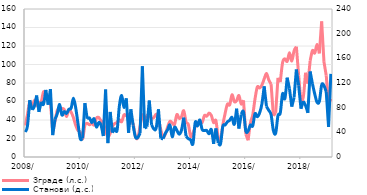
| Category | Зграде (л.с.) |
|---|---|
| 2008-01-01 | 34.062 |
| 2008-02-01 | 45.864 |
| 2008-03-01 | 59.806 |
| 2008-04-01 | 54.182 |
| 2008-05-01 | 61.311 |
| 2008-06-01 | 55.766 |
| 2008-07-01 | 59.093 |
| 2008-08-01 | 59.806 |
| 2008-09-01 | 70.5 |
| 2008-10-01 | 66.064 |
| 2008-11-01 | 62.499 |
| 2008-12-01 | 57.033 |
| 2009-01-01 | 26.616 |
| 2009-02-01 | 38.498 |
| 2009-03-01 | 50.617 |
| 2009-04-01 | 50.459 |
| 2009-05-01 | 52.201 |
| 2009-06-01 | 51.409 |
| 2009-07-01 | 43.646 |
| 2009-08-01 | 51.172 |
| 2009-09-01 | 48.478 |
| 2009-10-01 | 42.617 |
| 2009-11-01 | 34.22 |
| 2009-12-01 | 28.596 |
| 2010-01-01 | 26.695 |
| 2010-02-01 | 19.645 |
| 2010-03-01 | 34.22 |
| 2010-04-01 | 36.359 |
| 2010-05-01 | 34.854 |
| 2010-06-01 | 36.438 |
| 2010-07-01 | 34.695 |
| 2010-08-01 | 41.904 |
| 2010-09-01 | 42.775 |
| 2010-10-01 | 39.052 |
| 2010-11-01 | 36.913 |
| 2010-12-01 | 28.121 |
| 2011-01-01 | 21.863 |
| 2011-02-01 | 25.507 |
| 2011-03-01 | 33.032 |
| 2011-04-01 | 36.2 |
| 2011-05-01 | 37.309 |
| 2011-06-01 | 40.24 |
| 2011-07-01 | 38.102 |
| 2011-08-01 | 45.548 |
| 2011-09-01 | 44.597 |
| 2011-10-01 | 45.706 |
| 2011-11-01 | 38.814 |
| 2011-12-01 | 35.725 |
| 2012-01-01 | 21.942 |
| 2012-02-01 | 20.754 |
| 2012-03-01 | 33.27 |
| 2012-04-01 | 45.627 |
| 2012-05-01 | 38.894 |
| 2012-06-01 | 44.755 |
| 2012-07-01 | 44.597 |
| 2012-08-01 | 41.825 |
| 2012-09-01 | 42.696 |
| 2012-10-01 | 46.181 |
| 2012-11-01 | 40.478 |
| 2012-12-01 | 29.626 |
| 2013-01-01 | 21.546 |
| 2013-02-01 | 24.715 |
| 2013-03-01 | 32.636 |
| 2013-04-01 | 38.577 |
| 2013-05-01 | 36.676 |
| 2013-06-01 | 35.25 |
| 2013-07-01 | 45.864 |
| 2013-08-01 | 41.825 |
| 2013-09-01 | 43.409 |
| 2013-10-01 | 50.063 |
| 2013-11-01 | 37.943 |
| 2013-12-01 | 35.171 |
| 2014-01-01 | 22.259 |
| 2014-02-01 | 25.744 |
| 2014-03-01 | 32.715 |
| 2014-04-01 | 35.567 |
| 2014-05-01 | 38.418 |
| 2014-06-01 | 37.23 |
| 2014-07-01 | 44.835 |
| 2014-08-01 | 44.122 |
| 2014-09-01 | 47.449 |
| 2014-10-01 | 44.914 |
| 2014-11-01 | 37.151 |
| 2014-12-01 | 39.211 |
| 2015-01-01 | 21.071 |
| 2015-02-01 | 18.219 |
| 2015-03-01 | 34.616 |
| 2015-04-01 | 47.132 |
| 2015-05-01 | 57.113 |
| 2015-06-01 | 56.4 |
| 2015-07-01 | 67.252 |
| 2015-08-01 | 59.885 |
| 2015-09-01 | 60.915 |
| 2015-10-01 | 66.46 |
| 2015-11-01 | 57.271 |
| 2015-12-01 | 61.311 |
| 2016-01-01 | 24.715 |
| 2016-02-01 | 18.061 |
| 2016-03-01 | 36.676 |
| 2016-04-01 | 45.31 |
| 2016-05-01 | 62.737 |
| 2016-06-01 | 75.649 |
| 2016-07-01 | 74.698 |
| 2016-08-01 | 77.708 |
| 2016-09-01 | 84.441 |
| 2016-10-01 | 90.303 |
| 2016-11-01 | 83.253 |
| 2016-12-01 | 78.817 |
| 2017-01-01 | 44.597 |
| 2017-02-01 | 47.766 |
| 2017-03-01 | 85.55 |
| 2017-04-01 | 80.956 |
| 2017-05-01 | 102.027 |
| 2017-06-01 | 106.146 |
| 2017-07-01 | 103.373 |
| 2017-08-01 | 112.72 |
| 2017-09-01 | 103.769 |
| 2017-10-01 | 114.859 |
| 2017-11-01 | 119.295 |
| 2017-12-01 | 88.085 |
| 2018-01-01 | 62.341 |
| 2018-02-01 | 64.638 |
| 2018-03-01 | 91.095 |
| 2018-04-01 | 79.372 |
| 2018-05-01 | 104.007 |
| 2018-06-01 | 115.097 |
| 2018-07-01 | 112.324 |
| 2018-08-01 | 121.751 |
| 2018-09-30 | 112.007 |
| 2018-10-31 | 146.544 |
| 2018-11-30 | 102.898 |
| 2018-12-31 | 87.927 |
| 2019-01-31 | 56.321 |
| 2019-02-28 | 62.895 |